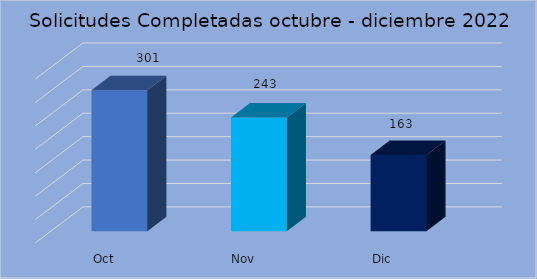
| Category | Series 0 |
|---|---|
| Oct | 301 |
| Nov | 243 |
| Dic | 163 |